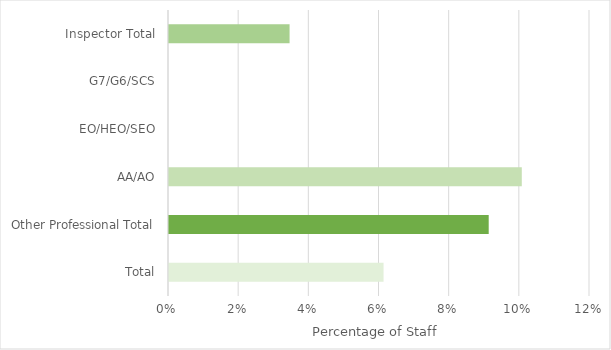
| Category | % Ethnic Minority* |
|---|---|
| Total | 0.061 |
| Other Professional Total | 0.091 |
| AA/AO | 0.101 |
| EO/HEO/SEO | 0 |
| G7/G6/SCS | 0 |
| Inspector Total | 0.035 |